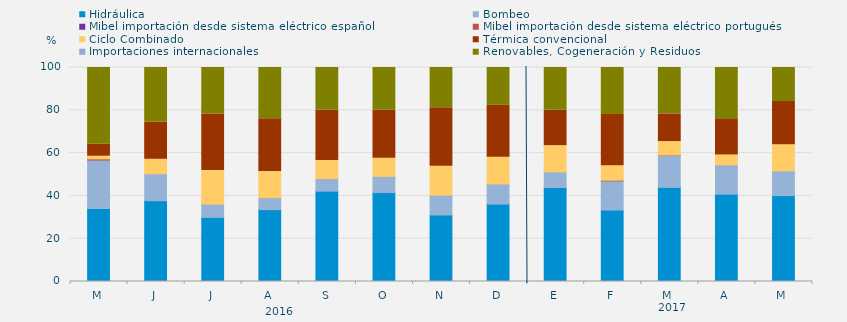
| Category | Hidráulica | Bombeo | Mibel importación desde sistema eléctrico español | Mibel importación desde sistema eléctrico portugués | Ciclo Combinado | Térmica convencional | Importaciones internacionales | Renovables, Cogeneración y Residuos |
|---|---|---|---|---|---|---|---|---|
| M | 34.117 | 22.648 | 0 | 0.538 | 1.232 | 5.645 | 0 | 35.82 |
| J | 37.755 | 12.593 | 0 | 0 | 6.759 | 17.315 | 0 | 25.579 |
| J | 29.951 | 6.228 | 0 | 0 | 15.636 | 26.478 | 0 | 21.707 |
| A | 33.591 | 5.589 | 0 | 0 | 12.265 | 24.597 | 0 | 23.958 |
| S | 42.211 | 5.903 | 0 | 0 | 8.391 | 23.542 | 0 | 19.954 |
| O | 41.555 | 7.572 | 0 | 0 | 8.468 | 22.469 | 0 | 19.937 |
| N | 31.088 | 9.259 | 0 | 0 | 13.495 | 27.361 | 0 | 18.796 |
| D | 36.178 | 9.409 | 0 | 0 | 12.522 | 24.194 | 0 | 17.697 |
| E | 43.929 | 7.303 | 0 | 0 | 12.254 | 16.51 | 0 | 20.004 |
| F | 33.383 | 13.641 | 0 | 0.298 | 6.82 | 23.884 | 0 | 21.974 |
| M | 43.966 | 14.984 | 0 | 0.135 | 6.303 | 12.943 | 0 | 21.669 |
| A | 40.799 | 13.738 | 0 | 0 | 4.583 | 16.933 | 0 | 23.947 |
| M | 40.143 | 11.559 | 0 | 0 | 12.186 | 20.228 | 0 | 15.883 |